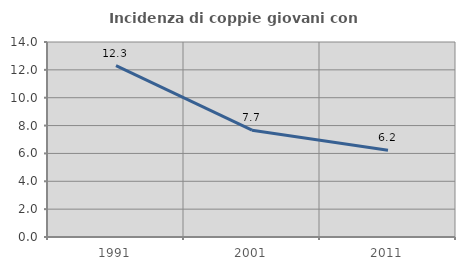
| Category | Incidenza di coppie giovani con figli |
|---|---|
| 1991.0 | 12.297 |
| 2001.0 | 7.669 |
| 2011.0 | 6.225 |